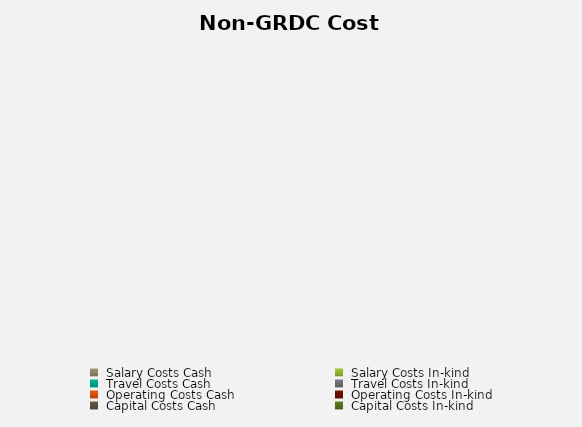
| Category | Series 1 |
|---|---|
|  Salary Costs Cash  | 0 |
|  Salary Costs In-kind  | 0 |
|  Travel Costs Cash  | 0 |
|  Travel Costs In-kind  | 0 |
|  Operating Costs Cash  | 0 |
|  Operating Costs In-kind  | 0 |
|  Capital Costs Cash   | 0 |
|  Capital Costs In-kind  | 0 |